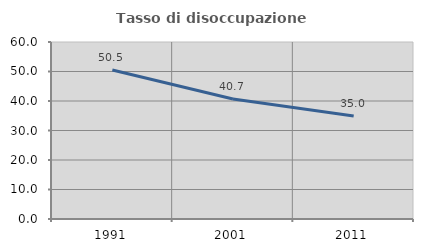
| Category | Tasso di disoccupazione giovanile  |
|---|---|
| 1991.0 | 50.526 |
| 2001.0 | 40.659 |
| 2011.0 | 34.951 |